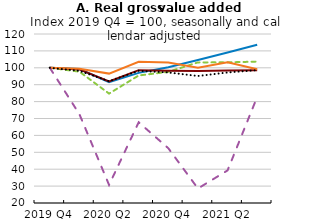
| Category | Chemicals and pharmaceuticals | Other manufacturing | Construction | Trade, repair of motor vehicles and motorcycles | Accommodation and food service activities | Other business sector services |
|---|---|---|---|---|---|---|
| 2019 Q4 | 100 | 100 | 100 | 100 | 100 | 100 |
| 2020 Q1 | 99.293 | 97.709 | 99.062 | 99.373 | 72.516 | 98.184 |
| 2020 Q2 | 91.454 | 84.737 | 91.94 | 96.569 | 30.687 | 92.072 |
| 2020 Q3 | 96.995 | 95.459 | 98.597 | 103.532 | 67.76 | 98.231 |
| 2020 Q4 | 100.32 | 97.613 | 98.206 | 103.151 | 52.399 | 97.243 |
| 2021 Q1 | 104.591 | 103.201 | 98.124 | 99.981 | 28.581 | 95.15 |
| 2021 Q2 | 109.027 | 103.228 | 98.335 | 103.262 | 39.288 | 97.235 |
| 2021 Q3 | 113.613 | 103.666 | 98.529 | 99.186 | 82.76 | 98.611 |